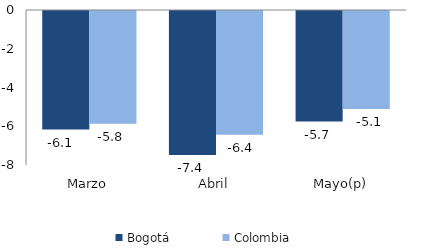
| Category | Bogotá | Colombia |
|---|---|---|
| Marzo | -6.118 | -5.818 |
| Abril | -7.436 | -6.388 |
| Mayo(p) | -5.709 | -5.063 |